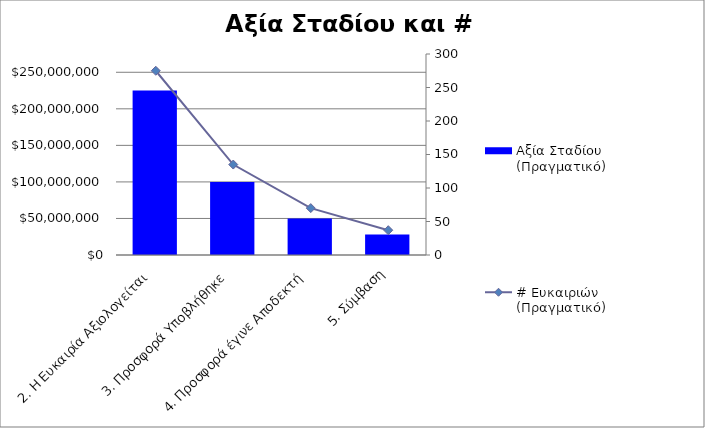
| Category | Αξία Σταδίου (Πραγματικό) |
|---|---|
| 2. Η Ευκαιρία Αξιολογείται | 225000000 |
| 3. Προσφορά Υποβλήθηκε | 100000000 |
| 4. Προσφορά έγινε Αποδεκτή | 50000000 |
| 5. Σύμβαση | 28000000 |